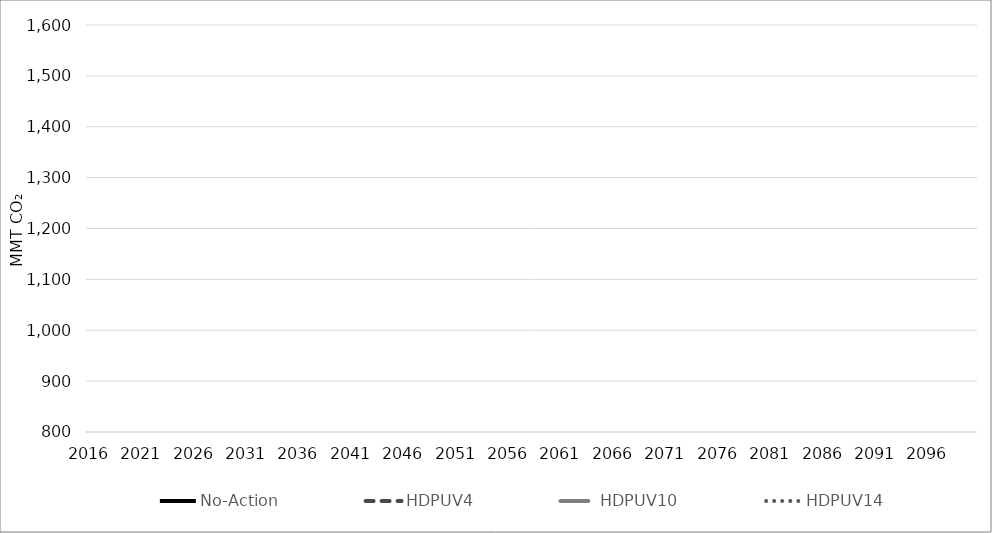
| Category | No-Action | HDPUV4 | HDPUV10 | HDPUV14 |
|---|---|---|---|---|
| 2016.0 | 193.479 | 193.479 | 193.479 | 193.479 |
| 2017.0 | 192.435 | 192.435 | 192.435 | 192.435 |
| 2018.0 | 191.39 | 191.39 | 191.39 | 191.39 |
| 2019.0 | 190.345 | 190.345 | 190.345 | 190.345 |
| 2020.0 | 189.301 | 189.301 | 189.301 | 189.301 |
| 2021.0 | 188.256 | 188.256 | 188.256 | 188.256 |
| 2022.0 | 186.311 | 186.311 | 186.311 | 186.311 |
| 2023.0 | 185.738 | 185.738 | 185.738 | 185.738 |
| 2024.0 | 183.938 | 183.938 | 183.938 | 183.938 |
| 2025.0 | 183.389 | 183.389 | 183.389 | 183.389 |
| 2026.0 | 183.412 | 183.412 | 183.412 | 183.412 |
| 2027.0 | 183.345 | 183.345 | 183.345 | 183.345 |
| 2028.0 | 182.85 | 182.85 | 182.85 | 182.85 |
| 2029.0 | 182.907 | 182.907 | 182.907 | 182.907 |
| 2030.0 | 180.18 | 180.177 | 180.171 | 180.161 |
| 2031.0 | 176.631 | 176.627 | 176.609 | 176.285 |
| 2032.0 | 173.176 | 173.169 | 173.14 | 172.541 |
| 2033.0 | 168.914 | 168.903 | 168.707 | 167.66 |
| 2034.0 | 164.89 | 164.873 | 164.522 | 163.064 |
| 2035.0 | 161.361 | 161.34 | 160.841 | 158.778 |
| 2036.0 | 157.484 | 157.46 | 156.802 | 154.171 |
| 2037.0 | 153.761 | 153.733 | 152.926 | 149.715 |
| 2038.0 | 150.391 | 150.36 | 149.413 | 145.659 |
| 2039.0 | 147.38 | 147.348 | 146.283 | 142.005 |
| 2040.0 | 144.669 | 144.633 | 143.469 | 138.696 |
| 2041.0 | 142.303 | 142.259 | 140.997 | 135.855 |
| 2042.0 | 140.232 | 140.182 | 138.83 | 133.332 |
| 2043.0 | 137.974 | 137.915 | 136.486 | 130.897 |
| 2044.0 | 136.01 | 135.943 | 134.443 | 128.765 |
| 2045.0 | 134.292 | 134.219 | 132.653 | 126.923 |
| 2046.0 | 132.727 | 132.647 | 131.025 | 125.259 |
| 2047.0 | 130.669 | 130.588 | 128.919 | 123.287 |
| 2048.0 | 128.821 | 128.74 | 127.026 | 121.511 |
| 2049.0 | 127.02 | 126.941 | 125.192 | 119.926 |
| 2050.0 | 125.297 | 125.221 | 123.443 | 118.417 |
| 2051.0 | 125.233 | 125.156 | 123.38 | 118.356 |
| 2052.0 | 125.169 | 125.092 | 123.316 | 118.295 |
| 2053.0 | 125.104 | 125.028 | 123.253 | 118.234 |
| 2054.0 | 125.04 | 124.963 | 123.189 | 118.174 |
| 2055.0 | 124.975 | 124.899 | 123.126 | 118.113 |
| 2056.0 | 124.911 | 124.835 | 123.062 | 118.052 |
| 2057.0 | 124.847 | 124.77 | 122.999 | 117.991 |
| 2058.0 | 124.782 | 124.706 | 122.936 | 117.93 |
| 2059.0 | 124.718 | 124.642 | 122.872 | 117.869 |
| 2060.0 | 124.653 | 124.577 | 122.809 | 117.808 |
| 2061.0 | 124.589 | 124.513 | 122.745 | 117.748 |
| 2062.0 | 124.525 | 124.449 | 122.682 | 117.687 |
| 2063.0 | 124.46 | 124.384 | 122.618 | 117.626 |
| 2064.0 | 124.396 | 124.32 | 122.555 | 117.565 |
| 2065.0 | 124.331 | 124.255 | 122.491 | 117.504 |
| 2066.0 | 124.294 | 124.218 | 122.455 | 117.469 |
| 2067.0 | 124.257 | 124.181 | 122.418 | 117.434 |
| 2068.0 | 124.22 | 124.144 | 122.382 | 117.399 |
| 2069.0 | 124.183 | 124.107 | 122.345 | 117.364 |
| 2070.0 | 124.146 | 124.07 | 122.308 | 117.329 |
| 2071.0 | 124.109 | 124.033 | 122.272 | 117.293 |
| 2072.0 | 124.071 | 123.996 | 122.235 | 117.258 |
| 2073.0 | 124.034 | 123.959 | 122.199 | 117.223 |
| 2074.0 | 123.997 | 123.921 | 122.162 | 117.188 |
| 2075.0 | 123.96 | 123.884 | 122.125 | 117.153 |
| 2076.0 | 123.923 | 123.847 | 122.089 | 117.118 |
| 2077.0 | 123.886 | 123.81 | 122.052 | 117.083 |
| 2078.0 | 123.849 | 123.773 | 122.016 | 117.048 |
| 2079.0 | 123.811 | 123.736 | 121.979 | 117.013 |
| 2080.0 | 123.774 | 123.699 | 121.943 | 116.978 |
| 2081.0 | 123.197 | 123.122 | 121.374 | 116.432 |
| 2082.0 | 122.621 | 122.546 | 120.806 | 115.887 |
| 2083.0 | 122.044 | 121.969 | 120.238 | 115.342 |
| 2084.0 | 121.467 | 121.393 | 119.669 | 114.797 |
| 2085.0 | 120.89 | 120.816 | 119.101 | 114.252 |
| 2086.0 | 120.313 | 120.24 | 118.533 | 113.706 |
| 2087.0 | 119.736 | 119.663 | 117.964 | 113.161 |
| 2088.0 | 119.159 | 119.087 | 117.396 | 112.616 |
| 2089.0 | 118.583 | 118.51 | 116.828 | 112.071 |
| 2090.0 | 118.006 | 117.934 | 116.259 | 111.526 |
| 2091.0 | 117.429 | 117.357 | 115.691 | 110.981 |
| 2092.0 | 116.852 | 116.781 | 115.123 | 110.435 |
| 2093.0 | 116.275 | 116.204 | 114.554 | 109.89 |
| 2094.0 | 115.698 | 115.628 | 113.986 | 109.345 |
| 2095.0 | 115.121 | 115.051 | 113.418 | 108.8 |
| 2096.0 | 115.121 | 115.051 | 113.418 | 108.8 |
| 2097.0 | 115.121 | 115.051 | 113.418 | 108.8 |
| 2098.0 | 115.121 | 115.051 | 113.418 | 108.8 |
| 2099.0 | 115.121 | 115.051 | 113.418 | 108.8 |
| 2100.0 | 115.121 | 115.051 | 113.418 | 108.8 |